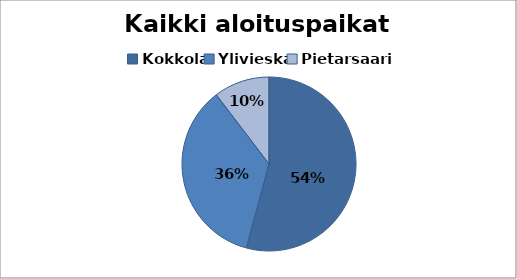
| Category | Series 0 |
|---|---|
| Kokkola | 298 |
| Ylivieska | 195 |
| Pietarsaari | 57 |